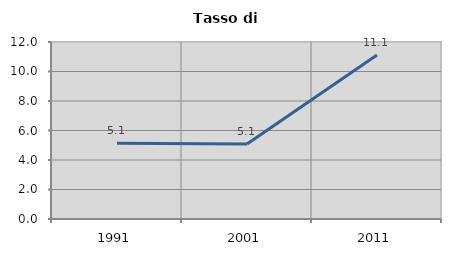
| Category | Tasso di disoccupazione   |
|---|---|
| 1991.0 | 5.14 |
| 2001.0 | 5.088 |
| 2011.0 | 11.111 |